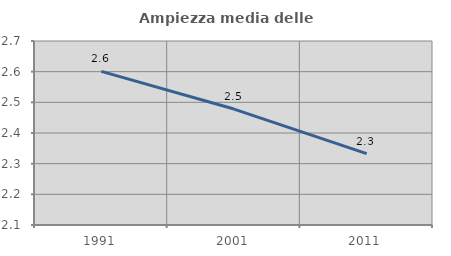
| Category | Ampiezza media delle famiglie |
|---|---|
| 1991.0 | 2.601 |
| 2001.0 | 2.478 |
| 2011.0 | 2.333 |